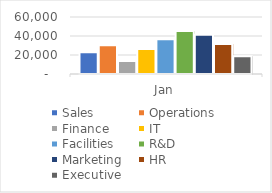
| Category | Sales | Operations | Finance | IT | Facilities | R&D | Marketing | HR | Executive |
|---|---|---|---|---|---|---|---|---|---|
| Jan | 22846 | 30249 | 13703 | 26274 | 36648 | 45158 | 41433 | 31618 | 18746 |